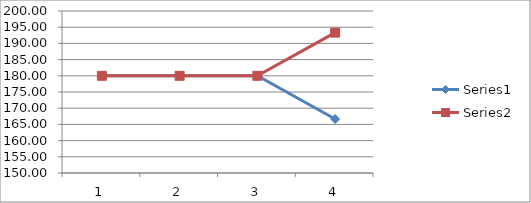
| Category | Series 0 | Series 1 |
|---|---|---|
| 0 | 180 | 180 |
| 1 | 180 | 180 |
| 2 | 180 | 180 |
| 3 | 166.66 | 193.33 |